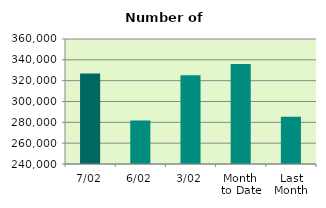
| Category | Series 0 |
|---|---|
| 7/02 | 326806 |
| 6/02 | 281708 |
| 3/02 | 325262 |
| Month 
to Date | 336038 |
| Last
Month | 285405.636 |